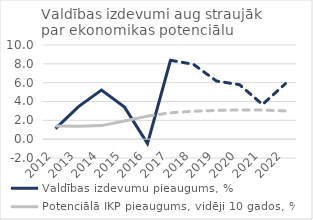
| Category | Valdības izdevumu pieaugums, % | Potenciālā IKP pieaugums, vidēji 10 gados, % |
|---|---|---|
| 2012 | 1.127 | 1.41 |
| 2013 | 3.456 | 1.359 |
| 2014 | 5.221 | 1.439 |
| 2015 | 3.403 | 1.938 |
| 2016 | -0.463 | 2.446 |
| 2017 | 8.379 | 2.802 |
| 2018 | 7.948 | 2.966 |
| 2019 | 6.171 | 3.055 |
| 2020 | 5.789 | 3.1 |
| 2021 | 3.684 | 3.091 |
| 2022 | 5.898 | 3 |